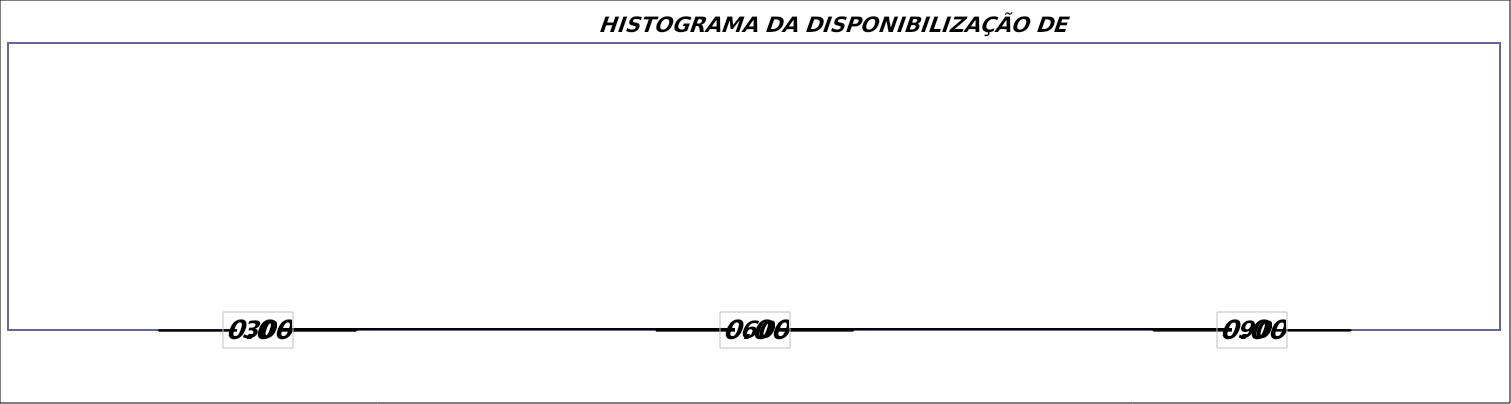
| Category | Series 0 | Series 1 |
|---|---|---|
| 0 | 30 | 0 |
| 1 | 60 | 0 |
| 2 | 90 | 0 |